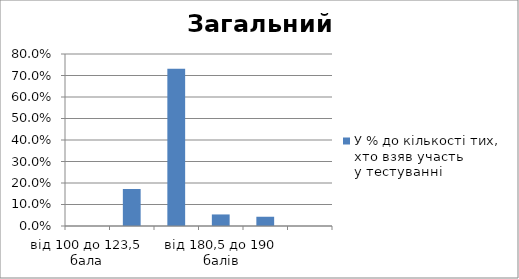
| Category | У % до кількості тих, хто взяв участь у тестуванні |
|---|---|
| від 100 до 123,5 бала | 0 |
| від 124 до 150 балів | 0.172 |
| від 150,5 до 180 балів | 0.731 |
| від 180,5 до 190 балів | 0.054 |
| від 190,5 до 199,5 бала | 0.043 |
| 200 балів | 0 |